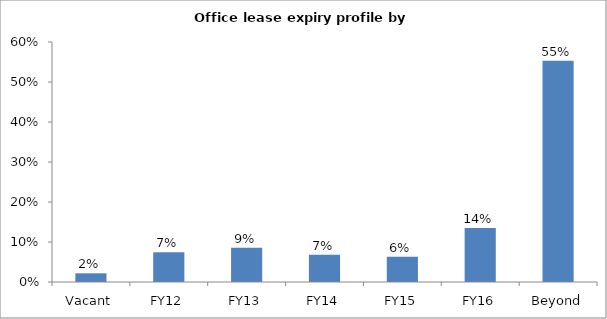
| Category | Series 0 |
|---|---|
| Vacant | 0.022 |
| FY12 | 0.074 |
| FY13 | 0.086 |
| FY14 | 0.068 |
| FY15 | 0.063 |
| FY16 | 0.135 |
| Beyond | 0.553 |